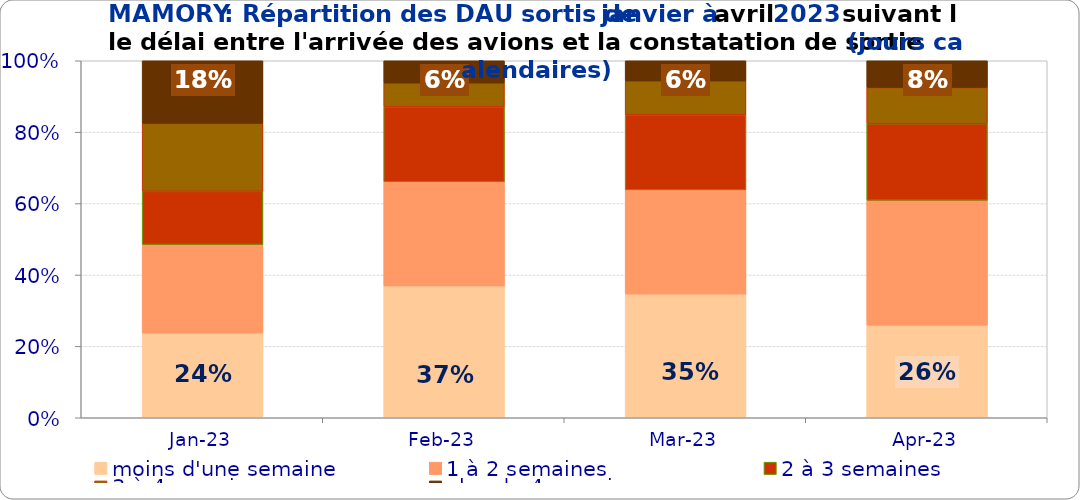
| Category | moins d'une semaine | 1 à 2 semaines | 2 à 3 semaines | 3 à 4 semaines | plus de 4 semaines |
|---|---|---|---|---|---|
| 2023-01-01 | 0.237 | 0.248 | 0.149 | 0.19 | 0.175 |
| 2023-02-01 | 0.369 | 0.292 | 0.21 | 0.066 | 0.062 |
| 2023-03-01 | 0.346 | 0.292 | 0.211 | 0.094 | 0.057 |
| 2023-04-01 | 0.259 | 0.35 | 0.215 | 0.101 | 0.075 |